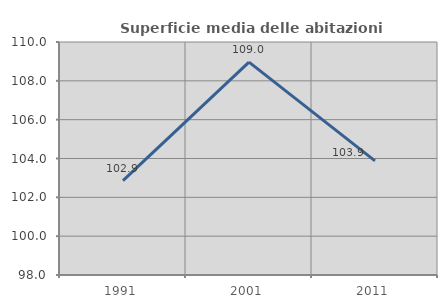
| Category | Superficie media delle abitazioni occupate |
|---|---|
| 1991.0 | 102.859 |
| 2001.0 | 108.964 |
| 2011.0 | 103.875 |